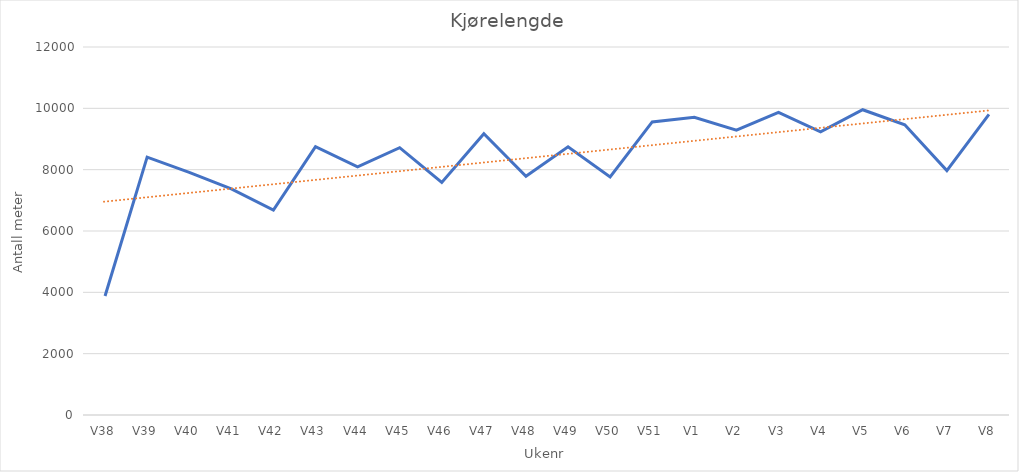
| Category | Kjørelengde |
|---|---|
| V38 | 3881.2 |
| V39 | 8409.542 |
| V40 | 7913.665 |
| V41 | 7375.45 |
| V42 | 6685.88 |
| V43 | 8751.389 |
| V44 | 8093.858 |
| V45 | 8717.796 |
| V46 | 7582.745 |
| V47 | 9173.192 |
| V48 | 7782.115 |
| V49 | 8747.007 |
| V50 | 7761.048 |
| V51 | 9555.92 |
| V1 | 9710.196 |
| V2 | 9287.119 |
| V3 | 9865.228 |
| V4 | 9232.515 |
| V5 | 9954.021 |
| V6 | 9463.348 |
| V7 | 7969.655 |
| V8 | 9803.3 |